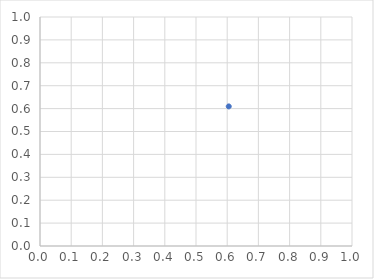
| Category | Series 0 |
|---|---|
| 0.6049512575409581 | 0.61 |